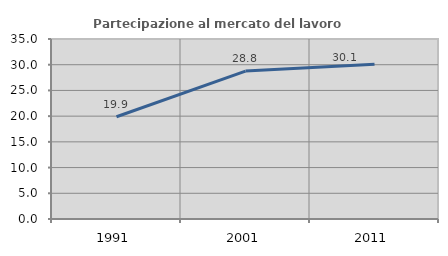
| Category | Partecipazione al mercato del lavoro  femminile |
|---|---|
| 1991.0 | 19.88 |
| 2001.0 | 28.754 |
| 2011.0 | 30.072 |